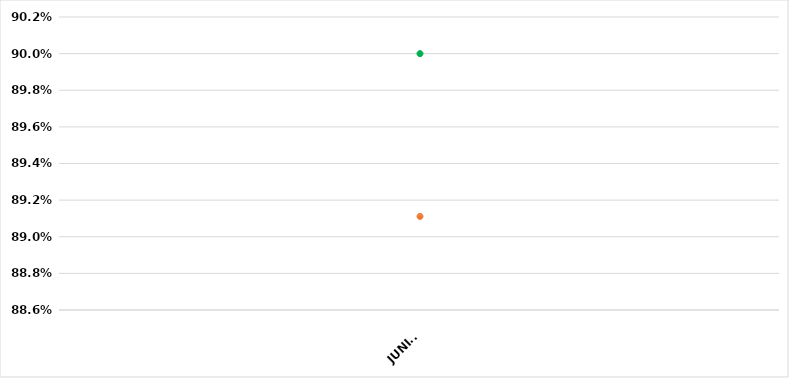
| Category | VALOR  | META PONDERADA |
|---|---|---|
| JUNIO | 0.891 | 0.9 |